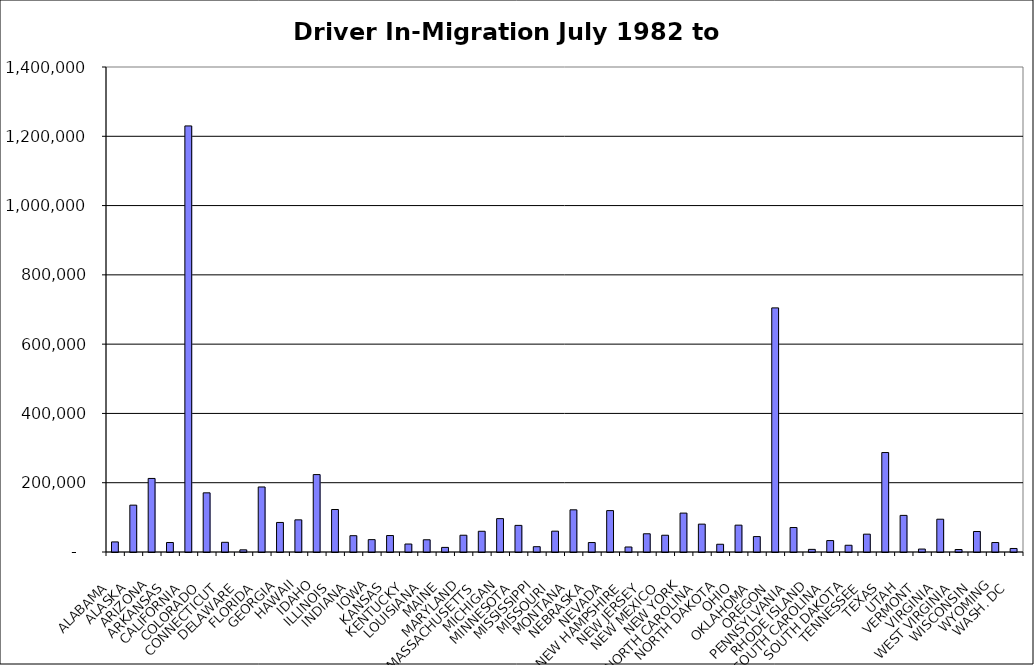
| Category | Series 0 |
|---|---|
|  ALABAMA  | 29132.5 |
|  ALASKA  | 135225.5 |
|  ARIZONA  | 212316 |
|  ARKANSAS  | 27383.5 |
|  CALIFORNIA  | 1229891.5 |
|  COLORADO  | 170792 |
|  CONNECTICUT  | 27976 |
|  DELAWARE  | 6226.5 |
|  FLORIDA  | 187708 |
|  GEORGIA  | 85264 |
|  HAWAII  | 92792.5 |
|  IDAHO  | 223444.5 |
|  ILLINOIS  | 122660.5 |
|  INDIANA  | 47075 |
|  IOWA  | 35691.5 |
|  KANSAS  | 47505.5 |
|  KENTUCKY  | 23036 |
|  LOUISIANA  | 35272.5 |
|  MAINE  | 13291.5 |
|  MARYLAND  | 48403 |
|  MASSACHUSETTS  | 59846 |
|  MICHIGAN  | 96381 |
|  MINNESOTA  | 76833.5 |
|  MISSISSIPPI  | 15333 |
|  MISSOURI  | 60163 |
|  MONTANA  | 121740 |
|  NEBRASKA  | 27325.5 |
|  NEVADA  | 119512 |
|  NEW HAMPSHIRE  | 14455.5 |
|  NEW JERSEY  | 52619 |
|  NEW MEXICO  | 48358 |
|  NEW YORK  | 112292 |
|  NORTH CAROLINA  | 80443.5 |
|  NORTH DAKOTA  | 22333.5 |
|  OHIO  | 77510.5 |
|  OKLAHOMA  | 44484 |
|  OREGON  | 704673 |
|  PENNSYLVANIA  | 70639.5 |
|  RHODE ISLAND  | 7613 |
|  SOUTH CAROLINA  | 32994.5 |
|  SOUTH DAKOTA  | 19481.5 |
|  TENNESSEE  | 51476.5 |
|  TEXAS  | 287105 |
|  UTAH  | 105691.5 |
|  VERMONT  | 8516 |
|  VIRGINIA  | 94648 |
|  WEST VIRGINIA  | 7164.5 |
|  WISCONSIN  | 59157.5 |
|  WYOMING  | 27376 |
|  WASH. DC  | 10174 |